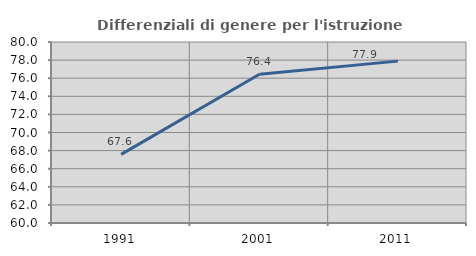
| Category | Differenziali di genere per l'istruzione superiore |
|---|---|
| 1991.0 | 67.582 |
| 2001.0 | 76.437 |
| 2011.0 | 77.886 |